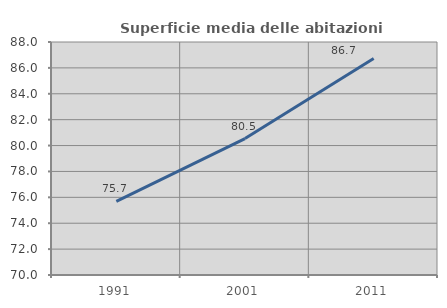
| Category | Superficie media delle abitazioni occupate |
|---|---|
| 1991.0 | 75.688 |
| 2001.0 | 80.542 |
| 2011.0 | 86.728 |